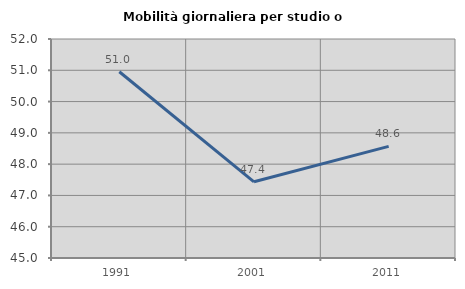
| Category | Mobilità giornaliera per studio o lavoro |
|---|---|
| 1991.0 | 50.953 |
| 2001.0 | 47.436 |
| 2011.0 | 48.567 |